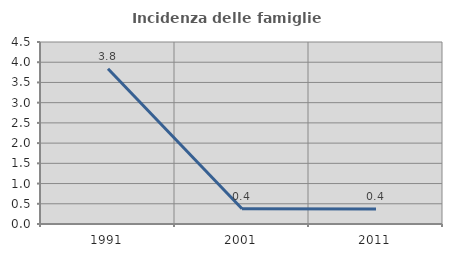
| Category | Incidenza delle famiglie numerose |
|---|---|
| 1991.0 | 3.839 |
| 2001.0 | 0.376 |
| 2011.0 | 0.374 |